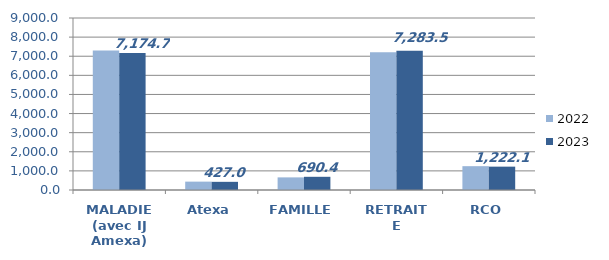
| Category | 2022 | 2023 |
|---|---|---|
| MALADIE (avec IJ Amexa) | 7293.362 | 7174.658 |
| Atexa | 437.877 | 427.03 |
| FAMILLE | 660.461 | 690.398 |
| RETRAITE | 7204.572 | 7283.46 |
| RCO | 1246.973 | 1222.141 |